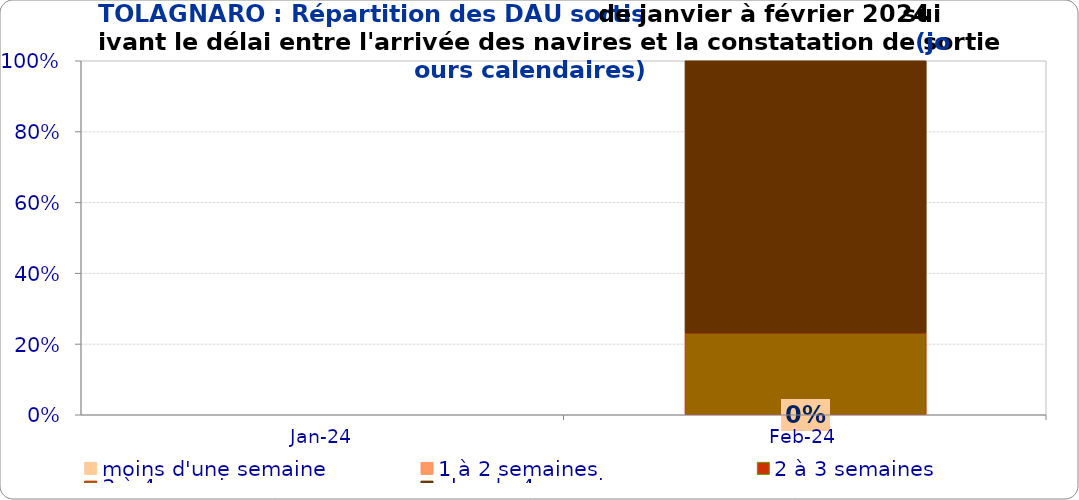
| Category | moins d'une semaine | 1 à 2 semaines | 2 à 3 semaines | 3 à 4 semaines | plus de 4 semaines |
|---|---|---|---|---|---|
| 2024-01-01 | 0 | 0 | 0 | 0 | 0 |
| 2024-02-01 | 0 | 0 | 0 | 0.231 | 0.769 |